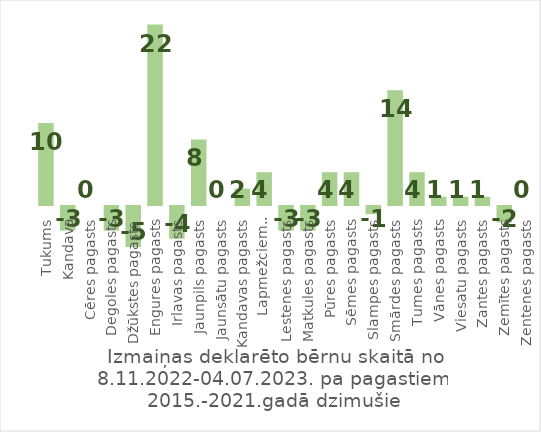
| Category | Series 0 |
|---|---|
| Tukums | 10 |
| Kandava | -3 |
| Cēres pagasts | 0 |
| Degoles pagasts | -3 |
| Džūkstes pagasts | -5 |
| Engures pagasts | 22 |
| Irlavas pagasts | -4 |
| Jaunpils pagasts | 8 |
| Jaunsātu pagasts | 0 |
| Kandavas pagasts | 2 |
| Lapmežciema pagasts | 4 |
| Lestenes pagasts | -3 |
| Matkules pagasts | -3 |
| Pūres pagasts | 4 |
| Sēmes pagasts | 4 |
| Slampes pagasts | -1 |
| Smārdes pagasts | 14 |
| Tumes pagasts | 4 |
| Vānes pagasts | 1 |
| Viesatu pagasts | 1 |
| Zantes pagasts | 1 |
| Zemītes pagasts | -2 |
| Zentenes pagasts | 0 |